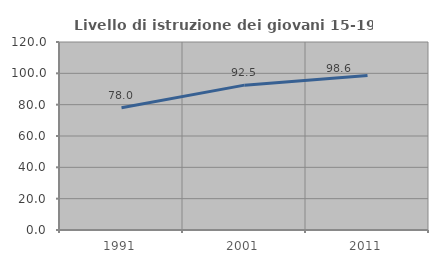
| Category | Livello di istruzione dei giovani 15-19 anni |
|---|---|
| 1991.0 | 77.975 |
| 2001.0 | 92.459 |
| 2011.0 | 98.649 |